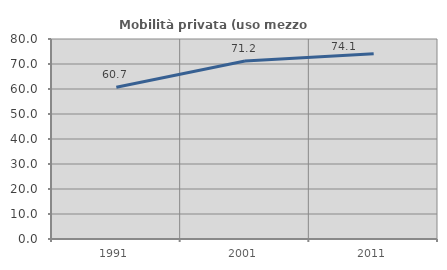
| Category | Mobilità privata (uso mezzo privato) |
|---|---|
| 1991.0 | 60.719 |
| 2001.0 | 71.193 |
| 2011.0 | 74.101 |